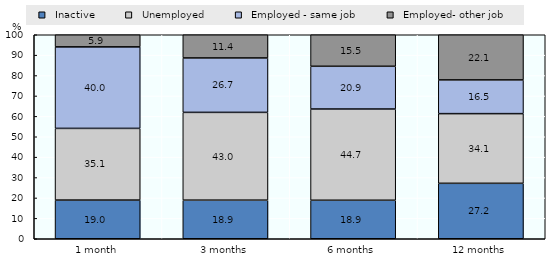
| Category |   Inactive |   Unemployed |   Employed - same job |   Employed- other job |
|---|---|---|---|---|
| 1 month | 18.959 | 35.143 | 39.955 | 5.943 |
| 3 months | 18.922 | 43.028 | 26.678 | 11.372 |
| 6 months | 18.878 | 44.724 | 20.944 | 15.455 |
| 12 months | 27.183 | 34.149 | 16.534 | 22.134 |